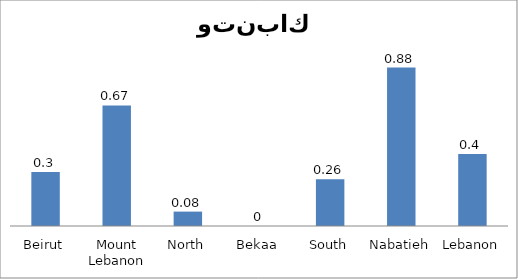
| Category | 02 |
|---|---|
| Beirut | 0.3 |
| Mount Lebanon | 0.67 |
| North | 0.08 |
| Bekaa | 0 |
| South | 0.26 |
| Nabatieh | 0.88 |
| Lebanon | 0.4 |